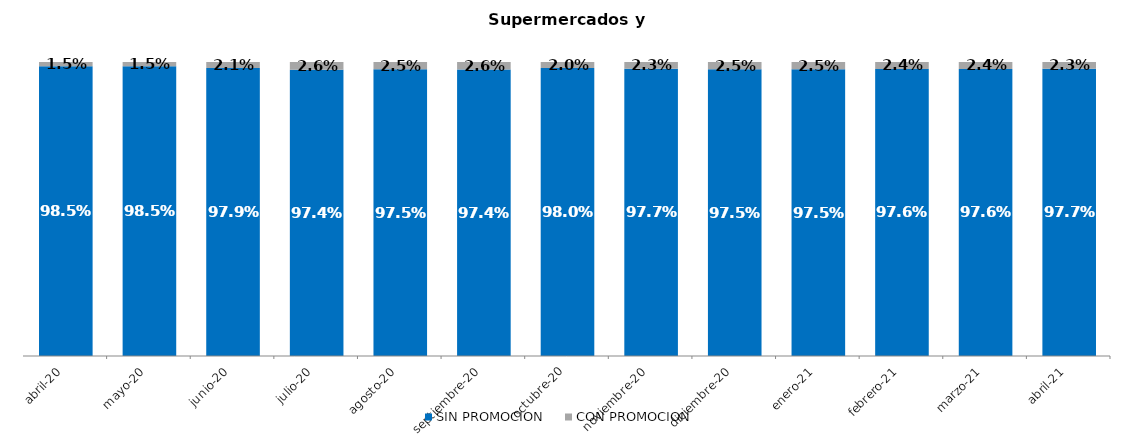
| Category | SIN PROMOCION   | CON PROMOCION   |
|---|---|---|
| 2020-04-01 | 0.985 | 0.015 |
| 2020-05-01 | 0.985 | 0.015 |
| 2020-06-01 | 0.979 | 0.021 |
| 2020-07-01 | 0.974 | 0.026 |
| 2020-08-01 | 0.975 | 0.025 |
| 2020-09-01 | 0.974 | 0.026 |
| 2020-10-01 | 0.98 | 0.02 |
| 2020-11-01 | 0.977 | 0.023 |
| 2020-12-01 | 0.975 | 0.025 |
| 2021-01-01 | 0.975 | 0.025 |
| 2021-02-01 | 0.976 | 0.024 |
| 2021-03-01 | 0.976 | 0.024 |
| 2021-04-01 | 0.977 | 0.023 |